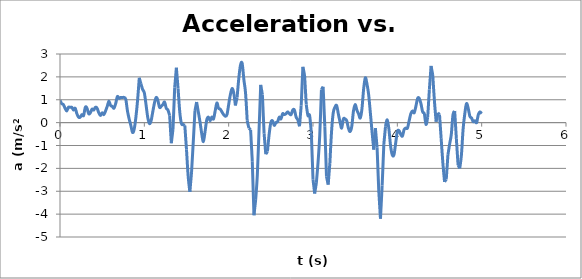
| Category | Series 0 |
|---|---|
| 0.0 | 0.98 |
| 0.02 | 0.83 |
| 0.04 | 0.79 |
| 0.06 | 0.63 |
| 0.08 | 0.51 |
| 0.1 | 0.67 |
| 0.12 | 0.67 |
| 0.14 | 0.67 |
| 0.16 | 0.55 |
| 0.18 | 0.63 |
| 0.2 | 0.39 |
| 0.22 | 0.24 |
| 0.24 | 0.24 |
| 0.26 | 0.35 |
| 0.28 | 0.31 |
| 0.3 | 0.67 |
| 0.32 | 0.63 |
| 0.34 | 0.39 |
| 0.36 | 0.43 |
| 0.38 | 0.59 |
| 0.4 | 0.55 |
| 0.42 | 0.67 |
| 0.44 | 0.63 |
| 0.46 | 0.43 |
| 0.48 | 0.31 |
| 0.5 | 0.43 |
| 0.52 | 0.35 |
| 0.54 | 0.51 |
| 0.56 | 0.71 |
| 0.58 | 0.94 |
| 0.6 | 0.75 |
| 0.62 | 0.71 |
| 0.64 | 0.63 |
| 0.66 | 0.83 |
| 0.68 | 1.14 |
| 0.7 | 1.06 |
| 0.72 | 1.1 |
| 0.74 | 1.1 |
| 0.76 | 1.1 |
| 0.78 | 1.02 |
| 0.8 | 0.51 |
| 0.82 | 0.16 |
| 0.84 | -0.12 |
| 0.86 | -0.43 |
| 0.88 | -0.28 |
| 0.9 | 0.24 |
| 0.92 | 0.98 |
| 0.94 | 1.96 |
| 0.96 | 1.69 |
| 0.98 | 1.45 |
| 1.0 | 1.3 |
| 1.02 | 0.79 |
| 1.04 | 0.24 |
| 1.06 | -0.04 |
| 1.08 | 0.08 |
| 1.1 | 0.47 |
| 1.12 | 0.86 |
| 1.14 | 1.1 |
| 1.16 | 0.98 |
| 1.18 | 0.67 |
| 1.2 | 0.71 |
| 1.22 | 0.79 |
| 1.24 | 0.9 |
| 1.26 | 0.63 |
| 1.28 | 0.55 |
| 1.3 | 0.31 |
| 1.32 | -0.9 |
| 1.34 | -0.28 |
| 1.36 | 1.53 |
| 1.38 | 2.4 |
| 1.4 | 1.49 |
| 1.42 | 0.47 |
| 1.44 | -0.04 |
| 1.46 | -0.08 |
| 1.48 | -0.12 |
| 1.5 | -1.18 |
| 1.52 | -2.36 |
| 1.54 | -3.03 |
| 1.56 | -2.16 |
| 1.58 | -0.86 |
| 1.6 | 0.51 |
| 1.62 | 0.9 |
| 1.64 | 0.47 |
| 1.66 | 0.04 |
| 1.68 | -0.47 |
| 1.7 | -0.83 |
| 1.72 | -0.39 |
| 1.74 | 0.12 |
| 1.76 | 0.24 |
| 1.78 | 0.08 |
| 1.8 | 0.24 |
| 1.82 | 0.16 |
| 1.84 | 0.51 |
| 1.86 | 0.86 |
| 1.88 | 0.63 |
| 1.9 | 0.59 |
| 1.92 | 0.47 |
| 1.94 | 0.35 |
| 1.96 | 0.28 |
| 1.98 | 0.35 |
| 2.0 | 0.79 |
| 2.02 | 1.22 |
| 2.04 | 1.49 |
| 2.06 | 1.3 |
| 2.08 | 0.75 |
| 2.1 | 1.1 |
| 2.12 | 1.93 |
| 2.14 | 2.51 |
| 2.16 | 2.59 |
| 2.18 | 1.89 |
| 2.2 | 1.3 |
| 2.22 | 0.08 |
| 2.24 | -0.24 |
| 2.26 | -0.31 |
| 2.28 | -1.69 |
| 2.3 | -4.05 |
| 2.32 | -3.38 |
| 2.34 | -2.28 |
| 2.36 | -0.35 |
| 2.38 | 1.65 |
| 2.4 | 1.22 |
| 2.42 | -0.47 |
| 2.44 | -1.38 |
| 2.46 | -1.26 |
| 2.48 | -0.51 |
| 2.5 | 0 |
| 2.52 | 0.08 |
| 2.54 | -0.12 |
| 2.56 | 0 |
| 2.58 | 0.04 |
| 2.6 | 0.24 |
| 2.62 | 0.16 |
| 2.64 | 0.39 |
| 2.66 | 0.35 |
| 2.68 | 0.39 |
| 2.7 | 0.47 |
| 2.72 | 0.39 |
| 2.74 | 0.35 |
| 2.76 | 0.55 |
| 2.78 | 0.55 |
| 2.8 | 0.24 |
| 2.82 | 0.12 |
| 2.84 | -0.16 |
| 2.86 | 0.75 |
| 2.88 | 2.44 |
| 2.9 | 2.08 |
| 2.92 | 0.79 |
| 2.94 | 0.31 |
| 2.96 | 0.31 |
| 2.98 | -0.43 |
| 3.0 | -2.48 |
| 3.02 | -3.1 |
| 3.04 | -2.63 |
| 3.06 | -1.73 |
| 3.08 | -0.55 |
| 3.1 | 1.45 |
| 3.12 | 1.57 |
| 3.14 | -0.16 |
| 3.16 | -2.36 |
| 3.18 | -2.71 |
| 3.2 | -1.77 |
| 3.22 | -0.39 |
| 3.24 | 0.43 |
| 3.26 | 0.67 |
| 3.28 | 0.75 |
| 3.3 | 0.39 |
| 3.32 | 0.04 |
| 3.34 | -0.24 |
| 3.36 | 0.16 |
| 3.38 | 0.16 |
| 3.4 | 0.08 |
| 3.42 | -0.24 |
| 3.44 | -0.39 |
| 3.46 | -0.16 |
| 3.48 | 0.51 |
| 3.5 | 0.79 |
| 3.52 | 0.55 |
| 3.54 | 0.39 |
| 3.56 | 0.2 |
| 3.58 | 0.59 |
| 3.6 | 1.45 |
| 3.62 | 1.96 |
| 3.64 | 1.69 |
| 3.66 | 1.22 |
| 3.68 | 0.43 |
| 3.7 | -0.39 |
| 3.72 | -1.18 |
| 3.74 | -0.24 |
| 3.76 | -1.1 |
| 3.78 | -2.99 |
| 3.8 | -4.2 |
| 3.82 | -2.75 |
| 3.84 | -0.94 |
| 3.86 | -0.16 |
| 3.88 | 0.12 |
| 3.9 | -0.28 |
| 3.92 | -1.02 |
| 3.94 | -1.41 |
| 3.96 | -1.41 |
| 3.98 | -0.9 |
| 4.0 | -0.39 |
| 4.02 | -0.35 |
| 4.04 | -0.51 |
| 4.06 | -0.59 |
| 4.08 | -0.31 |
| 4.1 | -0.24 |
| 4.12 | -0.24 |
| 4.14 | 0.08 |
| 4.16 | 0.39 |
| 4.18 | 0.51 |
| 4.2 | 0.43 |
| 4.22 | 0.71 |
| 4.24 | 1.06 |
| 4.26 | 1.06 |
| 4.28 | 0.83 |
| 4.3 | 0.47 |
| 4.32 | 0.39 |
| 4.34 | -0.08 |
| 4.36 | 0.24 |
| 4.38 | 1.45 |
| 4.4 | 2.48 |
| 4.42 | 2.08 |
| 4.44 | 0.94 |
| 4.46 | 0.04 |
| 4.48 | 0.43 |
| 4.5 | 0.35 |
| 4.52 | -0.71 |
| 4.54 | -1.77 |
| 4.56 | -2.59 |
| 4.58 | -2.48 |
| 4.6 | -1.41 |
| 4.62 | -0.94 |
| 4.64 | -0.51 |
| 4.66 | 0.35 |
| 4.68 | 0.51 |
| 4.7 | -0.71 |
| 4.72 | -1.85 |
| 4.74 | -2 |
| 4.76 | -1.41 |
| 4.78 | -0.28 |
| 4.8 | 0.39 |
| 4.82 | 0.83 |
| 4.84 | 0.63 |
| 4.86 | 0.28 |
| 4.88 | 0.2 |
| 4.9 | 0.04 |
| 4.92 | 0.08 |
| 4.94 | 0 |
| 4.96 | 0.35 |
| 4.98 | 0.47 |
| 5.0 | 0.39 |